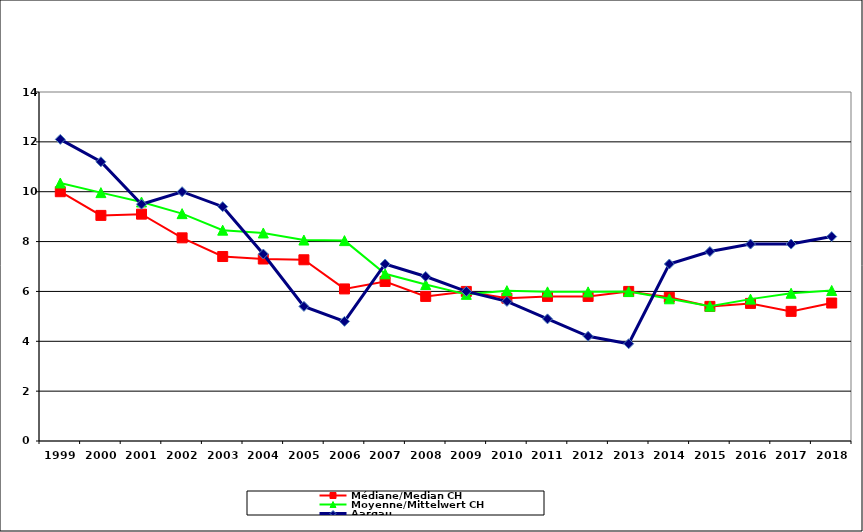
| Category | Médiane/Median CH | Moyenne/Mittelwert CH | Aargau |
|---|---|---|---|
| 1999.0 | 10 | 10.35 | 12.1 |
| 2000.0 | 9.05 | 9.964 | 11.2 |
| 2001.0 | 9.1 | 9.588 | 9.5 |
| 2002.0 | 8.15 | 9.121 | 10 |
| 2003.0 | 7.4 | 8.458 | 9.4 |
| 2004.0 | 7.3 | 8.345 | 7.5 |
| 2005.0 | 7.27 | 8.061 | 5.4 |
| 2006.0 | 6.1 | 8.039 | 4.8 |
| 2007.0 | 6.4 | 6.706 | 7.1 |
| 2008.0 | 5.8 | 6.277 | 6.6 |
| 2009.0 | 6 | 5.883 | 6 |
| 2010.0 | 5.73 | 6.031 | 5.6 |
| 2011.0 | 5.8 | 5.983 | 4.9 |
| 2012.0 | 5.8 | 5.983 | 4.2 |
| 2013.0 | 6 | 5.994 | 3.9 |
| 2014.0 | 5.765 | 5.705 | 7.1 |
| 2015.0 | 5.4 | 5.408 | 7.6 |
| 2016.0 | 5.52 | 5.692 | 7.9 |
| 2017.0 | 5.2 | 5.927 | 7.9 |
| 2018.0 | 5.535 | 6.039 | 8.2 |